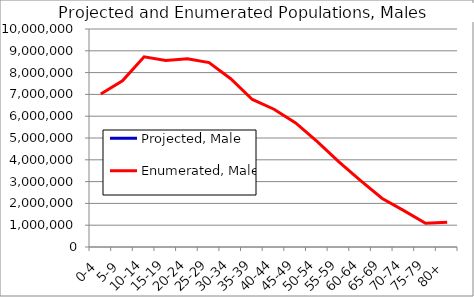
| Category | Projected, Male | Enumerated, Male |
|---|---|---|
| 0-4 |  | 7016987 |
| 5-9 |  | 7624144 |
| 10-14 |  | 8725413 |
| 15-19 |  | 8558868 |
| 20-24 |  | 8630227 |
| 25-29 |  | 8460995 |
| 30-34 |  | 7717657 |
| 35-39 |  | 6766665 |
| 40-44 |  | 6320570 |
| 45-49 |  | 5692013 |
| 50-54 |  | 4834995 |
| 55-59 |  | 3902344 |
| 60-64 |  | 3041034 |
| 65-69 |  | 2224065 |
| 70-74 |  | 1667373 |
| 75-79 |  | 1090518 |
| 80+ |  | 1133122 |